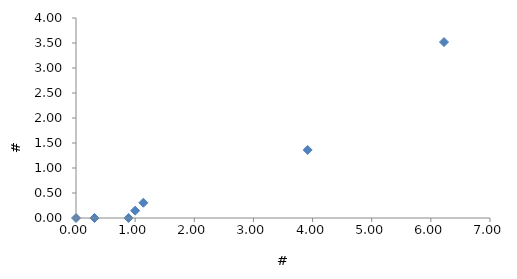
| Category | Trichoptera/Bag |
|---|---|
| 6.222222222222222 | 3.519 |
| 3.9166666666666665 | 1.361 |
| 0.3125 | 0 |
| 1.1388888888888888 | 0.306 |
| 0.0 | 0 |
| 0.8888888888888888 | 0 |
| 1.0 | 0.147 |